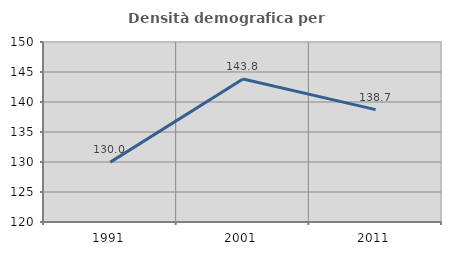
| Category | Densità demografica |
|---|---|
| 1991.0 | 129.976 |
| 2001.0 | 143.835 |
| 2011.0 | 138.729 |